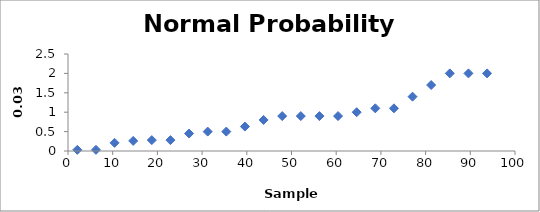
| Category | Series 0 |
|---|---|
| 2.0833333333333335 | 0.03 |
| 6.25 | 0.03 |
| 10.416666666666668 | 0.21 |
| 14.583333333333334 | 0.26 |
| 18.75 | 0.28 |
| 22.916666666666668 | 0.28 |
| 27.083333333333332 | 0.45 |
| 31.25 | 0.5 |
| 35.41666666666667 | 0.5 |
| 39.583333333333336 | 0.63 |
| 43.75000000000001 | 0.8 |
| 47.91666666666667 | 0.9 |
| 52.083333333333336 | 0.9 |
| 56.25000000000001 | 0.9 |
| 60.41666666666667 | 0.9 |
| 64.58333333333334 | 1 |
| 68.75 | 1.1 |
| 72.91666666666667 | 1.1 |
| 77.08333333333333 | 1.4 |
| 81.25 | 1.7 |
| 85.41666666666667 | 2 |
| 89.58333333333333 | 2 |
| 93.75 | 2 |